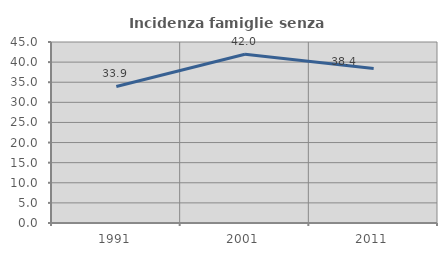
| Category | Incidenza famiglie senza nuclei |
|---|---|
| 1991.0 | 33.945 |
| 2001.0 | 41.964 |
| 2011.0 | 38.406 |